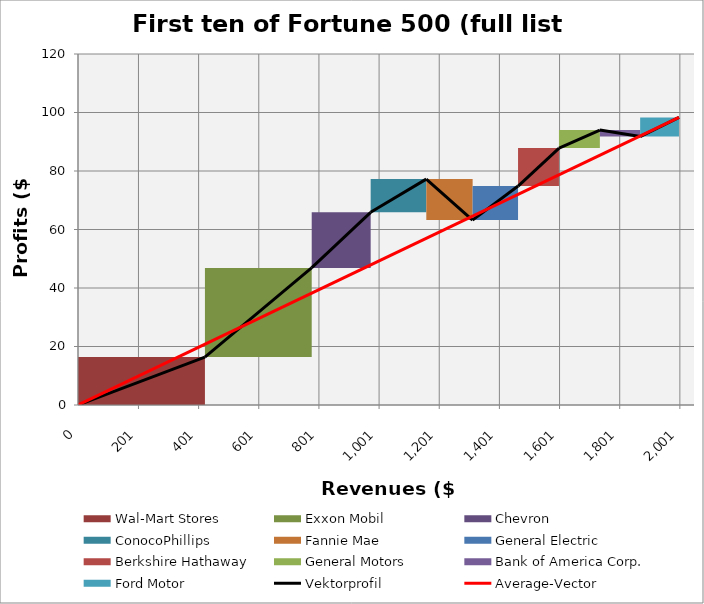
| Category | transparent | Wal-Mart Stores | Exxon Mobil | Chevron | ConocoPhillips | Fannie Mae | General Electric | Berkshire Hathaway | General Motors | Bank of America Corp. | Ford Motor | Border right & top |
|---|---|---|---|---|---|---|---|---|---|---|---|---|
| 0.0 | 0 | 16.389 | 0 | 0 | 0 | 0 | 0 | 0 | 0 | 0 | 0 | 0 |
| 421.849 | 0 | 16.389 | 0 | 0 | 0 | 0 | 0 | 0 | 0 | 0 | 0 | 0 |
| 421.849 | 16.389 | 0 | 30.46 | 0 | 0 | 0 | 0 | 0 | 0 | 0 | 0 | 0 |
| 776.5229999999999 | 16.389 | 0 | 30.46 | 0 | 0 | 0 | 0 | 0 | 0 | 0 | 0 | 0 |
| 776.5229999999999 | 46.849 | 0 | 0 | 19.024 | 0 | 0 | 0 | 0 | 0 | 0 | 0 | 0 |
| 972.8599999999999 | 46.849 | 0 | 0 | 19.024 | 0 | 0 | 0 | 0 | 0 | 0 | 0 | 0 |
| 972.8599999999999 | 65.873 | 0 | 0 | 0 | 11.358 | 0 | 0 | 0 | 0 | 0 | 0 | 0 |
| 1157.826 | 65.873 | 0 | 0 | 0 | 11.358 | 0 | 0 | 0 | 0 | 0 | 0 | 0 |
| 1157.826 | 77.231 | 0 | 0 | 0 | 0 | -14.014 | 0 | 0 | 0 | 0 | 0 | 0 |
| 1311.651 | 77.231 | 0 | 0 | 0 | 0 | -14.014 | 0 | 0 | 0 | 0 | 0 | 0 |
| 1311.651 | 63.217 | 0 | 0 | 0 | 0 | 0 | 11.644 | 0 | 0 | 0 | 0 | 0 |
| 1463.279 | 63.217 | 0 | 0 | 0 | 0 | 0 | 11.644 | 0 | 0 | 0 | 0 | 0 |
| 1463.279 | 74.861 | 0 | 0 | 0 | 0 | 0 | 0 | 12.967 | 0 | 0 | 0 | 0 |
| 1599.464 | 74.861 | 0 | 0 | 0 | 0 | 0 | 0 | 12.967 | 0 | 0 | 0 | 0 |
| 1599.464 | 87.828 | 0 | 0 | 0 | 0 | 0 | 0 | 0 | 6.172 | 0 | 0 | 0 |
| 1735.056 | 87.828 | 0 | 0 | 0 | 0 | 0 | 0 | 0 | 6.172 | 0 | 0 | 0 |
| 1735.056 | 94 | 0 | 0 | 0 | 0 | 0 | 0 | 0 | 0 | -2.238 | 0 | 0 |
| 1869.25 | 94 | 0 | 0 | 0 | 0 | 0 | 0 | 0 | 0 | -2.238 | 0 | 0 |
| 1869.25 | 91.762 | 0 | 0 | 0 | 0 | 0 | 0 | 0 | 0 | 0 | 6.561 | 0 |
| 1998.204 | 91.762 | 0 | 0 | 0 | 0 | 0 | 0 | 0 | 0 | 0 | 6.561 | 0 |
| 1998.204 | 98.323 | 0 | 0 | 0 | 0 | 0 | 0 | 0 | 0 | 0 | 0 | 0 |
| 2048.2039999999997 | 98.323 | 0 | 0 | 0 | 0 | 0 | 0 | 0 | 0 | 0 | 0 | 0 |
| 2048.2039999999997 | 98.323 | 0 | 0 | 0 | 0 | 0 | 0 | 0 | 0 | 0 | 0 | 0 |